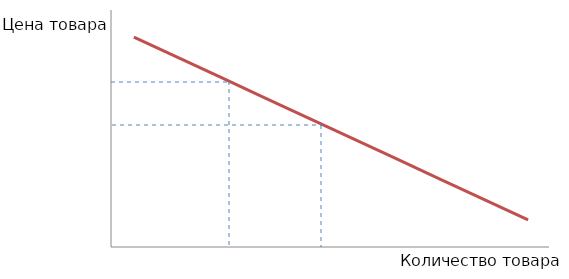
| Category | Цена товара |
|---|---|
| 1.0 | 310 |
| 2.0 | 280 |
| 3.0 | 250 |
| 4.0 | 220 |
| 5.0 | 190 |
| 6.0 | 160 |
| 7.0 | 130 |
| 8.0 | 100 |
| 9.0 | 70 |
| 10.0 | 40 |